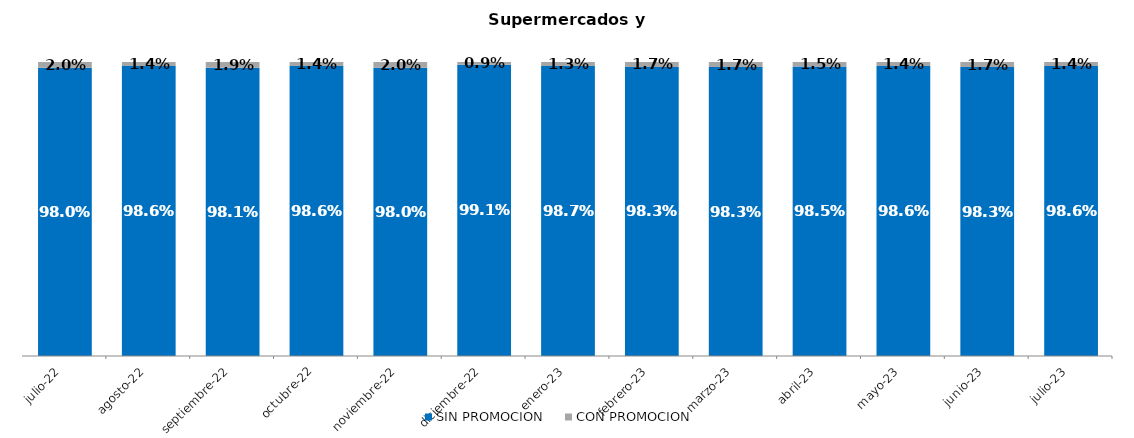
| Category | SIN PROMOCION   | CON PROMOCION   |
|---|---|---|
| 2022-07-01 | 0.98 | 0.02 |
| 2022-08-01 | 0.986 | 0.014 |
| 2022-09-01 | 0.981 | 0.019 |
| 2022-10-01 | 0.986 | 0.014 |
| 2022-11-01 | 0.98 | 0.02 |
| 2022-12-01 | 0.991 | 0.009 |
| 2023-01-01 | 0.987 | 0.013 |
| 2023-02-01 | 0.983 | 0.017 |
| 2023-03-01 | 0.983 | 0.017 |
| 2023-04-01 | 0.985 | 0.015 |
| 2023-05-01 | 0.986 | 0.014 |
| 2023-06-01 | 0.983 | 0.017 |
| 2023-07-01 | 0.986 | 0.014 |